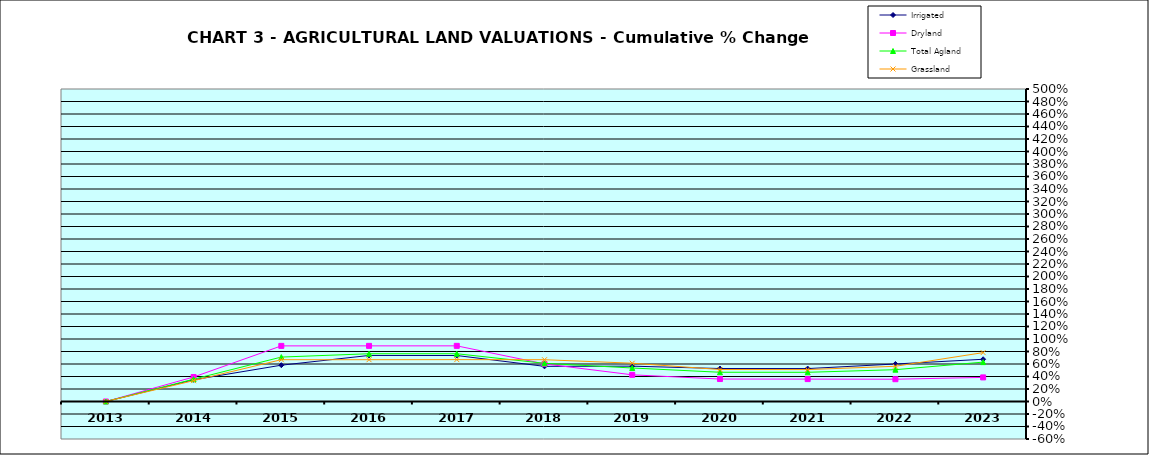
| Category | Irrigated | Dryland | Total Agland | Grassland |
|---|---|---|---|---|
| 2013.0 | 0 | 0 | 0 | 0 |
| 2014.0 | 0.347 | 0.392 | 0.357 | 0.334 |
| 2015.0 | 0.581 | 0.89 | 0.711 | 0.669 |
| 2016.0 | 0.737 | 0.89 | 0.764 | 0.669 |
| 2017.0 | 0.736 | 0.89 | 0.764 | 0.67 |
| 2018.0 | 0.562 | 0.602 | 0.611 | 0.669 |
| 2019.0 | 0.565 | 0.427 | 0.536 | 0.613 |
| 2020.0 | 0.528 | 0.359 | 0.468 | 0.512 |
| 2021.0 | 0.527 | 0.358 | 0.467 | 0.511 |
| 2022.0 | 0.6 | 0.357 | 0.509 | 0.564 |
| 2023.0 | 0.676 | 0.385 | 0.63 | 0.782 |